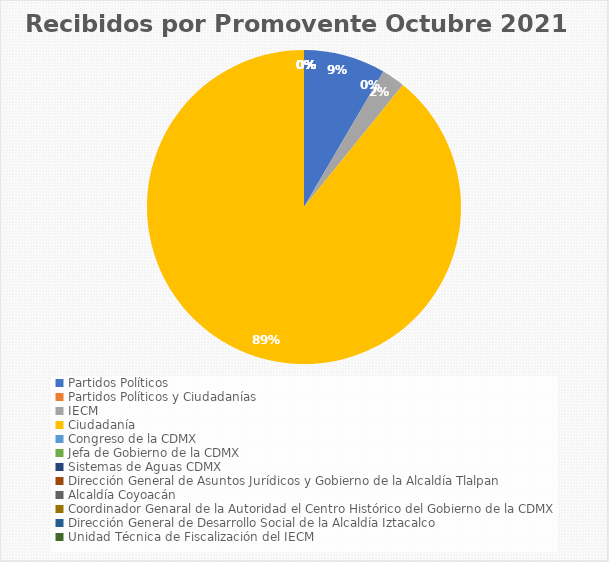
| Category | Recibidos por Promovente Octubre |
|---|---|
| Partidos Políticos | 7 |
| Partidos Políticos y Ciudadanías | 0 |
| IECM | 2 |
| Ciudadanía  | 74 |
| Congreso de la CDMX | 0 |
| Jefa de Gobierno de la CDMX | 0 |
| Sistemas de Aguas CDMX | 0 |
| Dirección General de Asuntos Jurídicos y Gobierno de la Alcaldía Tlalpan | 0 |
| Alcaldía Coyoacán | 0 |
| Coordinador Genaral de la Autoridad el Centro Histórico del Gobierno de la CDMX | 0 |
| Dirección General de Desarrollo Social de la Alcaldía Iztacalco | 0 |
| Unidad Técnica de Fiscalización del IECM | 0 |